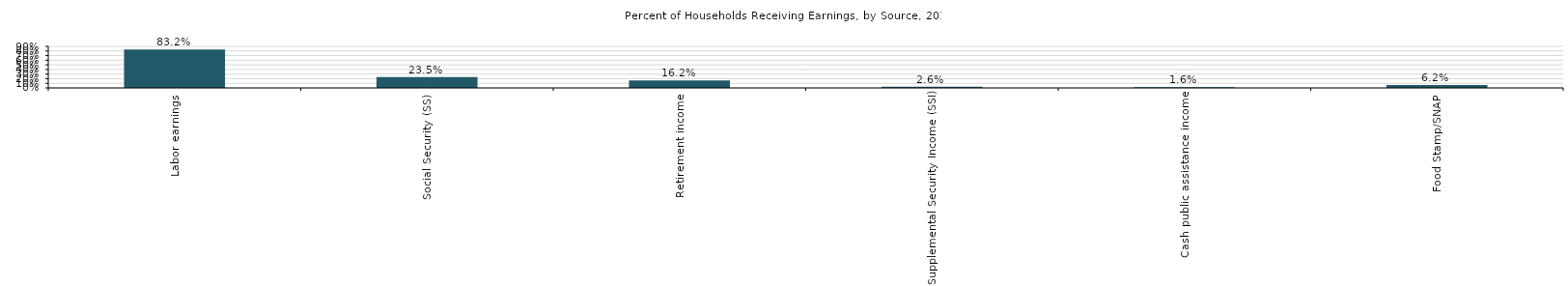
| Category | County Region |
|---|---|
| Labor earnings | 0.867 |
| Social Security (SS) | 0.193 |
| Retirement income | 0.134 |
| Supplemental Security Income (SSI) | 0.015 |
| Cash public assistance income | 0.017 |
| Food Stamp/SNAP | 0.052 |